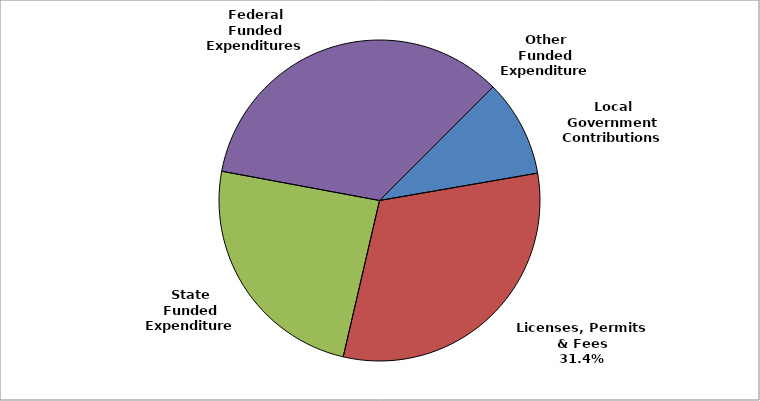
| Category | Series 0 |
|---|---|
| Local Government Contributions | 0.098 |
| Licenses, Permits & Fees | 0.314 |
| State Funded Expenditures | 0.243 |
| Federal Funded Expenditures | 0.346 |
| Other Funded Expenditures | 0 |